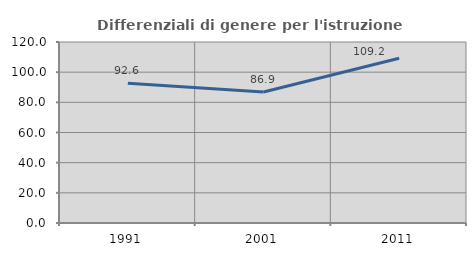
| Category | Differenziali di genere per l'istruzione superiore |
|---|---|
| 1991.0 | 92.615 |
| 2001.0 | 86.871 |
| 2011.0 | 109.2 |